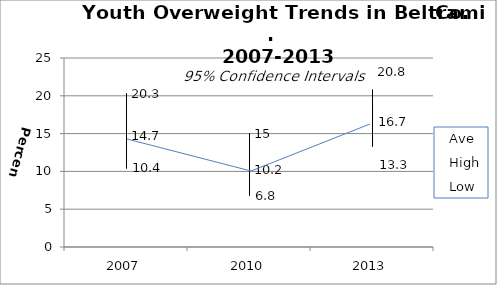
| Category | Ave | High | Low |
|---|---|---|---|
| 2007.0 | 14.7 | 20.3 | 10.4 |
| 2010.0 | 10.2 | 15 | 6.8 |
| 2013.0 | 16.7 | 20.8 | 13.3 |